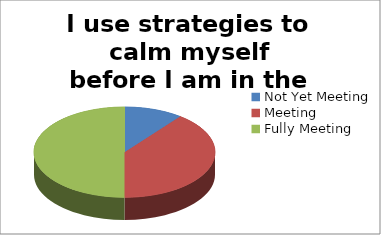
| Category | I use strategies to calm myself before I am in the red zone |
|---|---|
| Not Yet Meeting | 4 |
| Meeting | 15 |
| Fully Meeting | 19 |